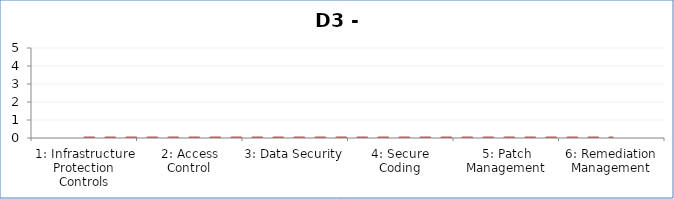
| Category | Assessment Factor Maturity |
|---|---|
| 1: Infrastructure Protection Controls | 0 |
| 2: Access Control | 0 |
| 3: Data Security | 0 |
| 4: Secure Coding | 0 |
| 5: Patch Management | 0 |
| 6: Remediation Management | 0 |